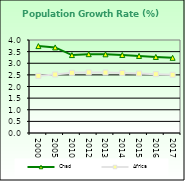
| Category | Chad | Africa  |
|---|---|---|
| 2000.0 | 3.738 | 2.458 |
| 2005.0 | 3.681 | 2.516 |
| 2010.0 | 3.352 | 2.59 |
| 2012.0 | 3.39 | 2.606 |
| 2013.0 | 3.384 | 2.601 |
| 2014.0 | 3.357 | 2.584 |
| 2015.0 | 3.315 | 2.559 |
| 2016.0 | 3.272 | 2.531 |
| 2017.0 | 3.233 | 2.503 |